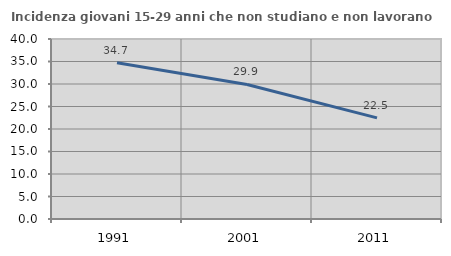
| Category | Incidenza giovani 15-29 anni che non studiano e non lavorano  |
|---|---|
| 1991.0 | 34.731 |
| 2001.0 | 29.89 |
| 2011.0 | 22.471 |